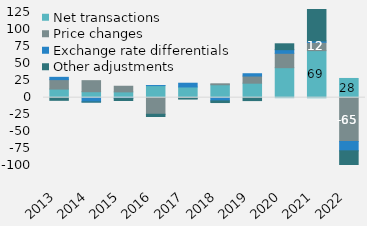
| Category | Net transactions | Price changes | Exchange rate differentials | Other adjustments |
|---|---|---|---|---|
| 2013 | 12733 | 13859.422 | 3401.116 | -3912.845 |
| 2014 | 8776 | 16304.32 | -6255.205 | -268.851 |
| 2015 | 8556 | 8282.683 | -1150.283 | -3046.313 |
| 2016 | 17803 | -24454.332 | 75.483 | -3319.324 |
| 2017 | 15779 | -991.149 | 5529.245 | -1079.465 |
| 2018 | 19027.845 | 1421.458 | -4768.997 | -2416.685 |
| 2019 | 21356.983 | 10529.971 | 3415.478 | -4305.729 |
| 2020 | 44202.613 | 21238.066 | 5326.846 | 8674.345 |
| 2021 | 69365.178 | 12214.466 | 2020.445 | 50748.282 |
| 2022 | 28328 | -64646 | -13736 | -21983 |